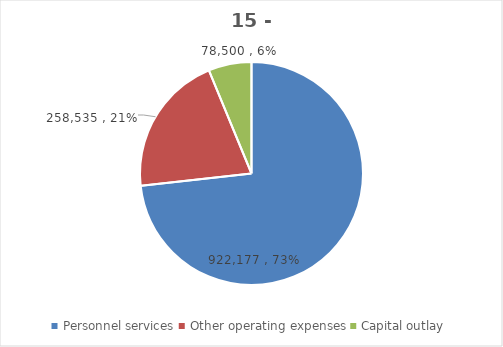
| Category | Series 0 | Series 1 | Series 2 | Series 3 | Series 4 | Series 5 | Series 6 |
|---|---|---|---|---|---|---|---|
| Personnel services | 922177 |  |  | 790148 | 871904 | 922175.897 | 922177 |
| Other operating expenses | 258535 |  |  | 287862 | 273824 | 258535 | 258535 |
| Capital outlay | 78500 |  |  | 82020 | 77000 | 78500 | 78500 |